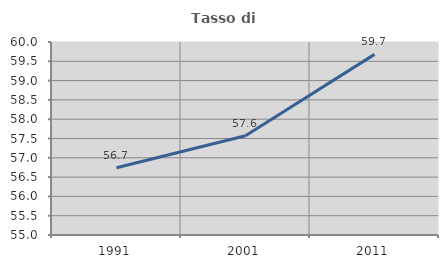
| Category | Tasso di occupazione   |
|---|---|
| 1991.0 | 56.742 |
| 2001.0 | 57.572 |
| 2011.0 | 59.679 |